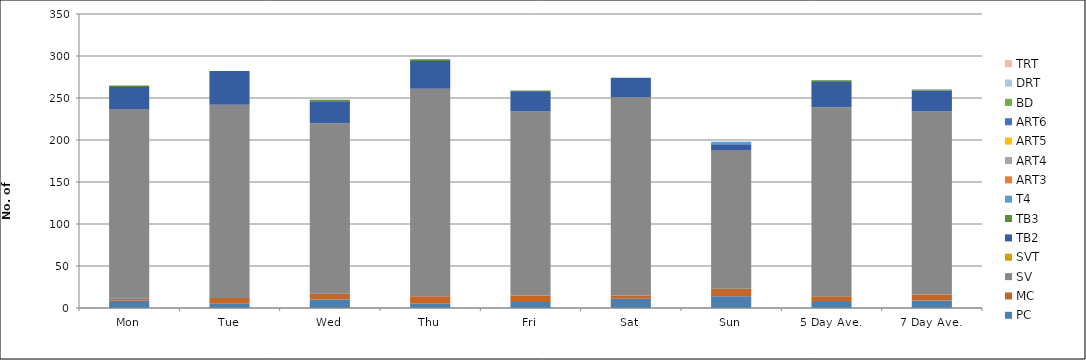
| Category | PC | MC | SV | SVT | TB2 | TB3 | T4 | ART3 | ART4 | ART5 | ART6 | BD | DRT | TRT |
|---|---|---|---|---|---|---|---|---|---|---|---|---|---|---|
| Mon | 9 | 2 | 226 | 0 | 26 | 2 | 0 | 0 | 0 | 0 | 0 | 0 | 0 | 0 |
| Tue | 5 | 7 | 230 | 0 | 40 | 0 | 0 | 0 | 0 | 0 | 0 | 0 | 0 | 0 |
| Wed | 10 | 7 | 203 | 0 | 26 | 2 | 0 | 0 | 0 | 0 | 0 | 0 | 0 | 0 |
| Thu | 5 | 9 | 247 | 0 | 33 | 2 | 0 | 0 | 0 | 0 | 0 | 0 | 0 | 0 |
| Fri | 7 | 8 | 219 | 0 | 23 | 2 | 0 | 0 | 0 | 0 | 0 | 0 | 0 | 0 |
| Sat | 11 | 4 | 236 | 0 | 23 | 0 | 0 | 0 | 0 | 0 | 0 | 0 | 0 | 0 |
| Sun | 14 | 9 | 165 | 0 | 7 | 0 | 3 | 0 | 0 | 0 | 0 | 0 | 0 | 0 |
| 5 Day Ave. | 7 | 7 | 225 | 0 | 30 | 2 | 0 | 0 | 0 | 0 | 0 | 0 | 0 | 0 |
| 7 Day Ave. | 9 | 7 | 218 | 0 | 25 | 1 | 0 | 0 | 0 | 0 | 0 | 0 | 0 | 0 |